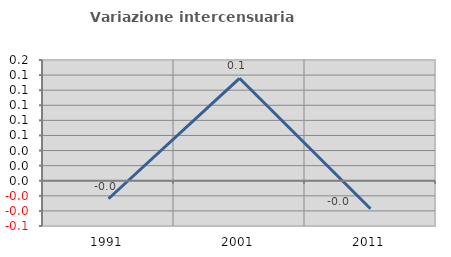
| Category | Variazione intercensuaria annua |
|---|---|
| 1991.0 | -0.024 |
| 2001.0 | 0.136 |
| 2011.0 | -0.037 |